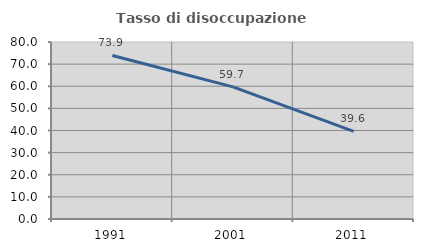
| Category | Tasso di disoccupazione giovanile  |
|---|---|
| 1991.0 | 73.913 |
| 2001.0 | 59.725 |
| 2011.0 | 39.607 |